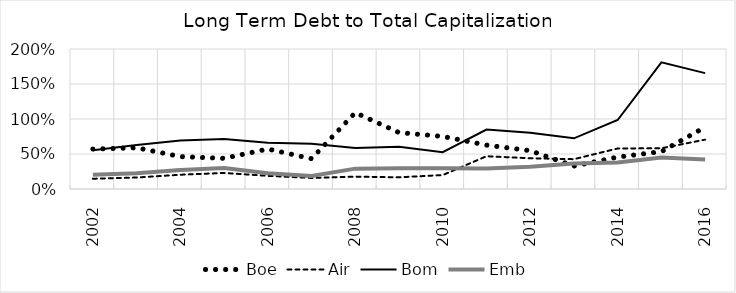
| Category | Boe | Air | Bom | Emb |
|---|---|---|---|---|
| 2002.0 | 0.57 | 0.147 | 0.552 | 0.205 |
| 2003.0 | 0.589 | 0.164 | 0.627 | 0.224 |
| 2004.0 | 0.463 | 0.204 | 0.694 | 0.273 |
| 2005.0 | 0.438 | 0.229 | 0.713 | 0.299 |
| 2006.0 | 0.571 | 0.188 | 0.662 | 0.225 |
| 2007.0 | 0.433 | 0.158 | 0.646 | 0.186 |
| 2008.0 | 1.091 | 0.176 | 0.585 | 0.291 |
| 2009.0 | 0.806 | 0.167 | 0.602 | 0.297 |
| 2010.0 | 0.751 | 0.199 | 0.525 | 0.298 |
| 2011.0 | 0.627 | 0.468 | 0.85 | 0.294 |
| 2012.0 | 0.548 | 0.439 | 0.805 | 0.319 |
| 2013.0 | 0.328 | 0.426 | 0.724 | 0.363 |
| 2014.0 | 0.456 | 0.579 | 0.986 | 0.379 |
| 2015.0 | 0.534 | 0.582 | 1.809 | 0.449 |
| 2016.0 | 0.884 | 0.705 | 1.655 | 0.422 |